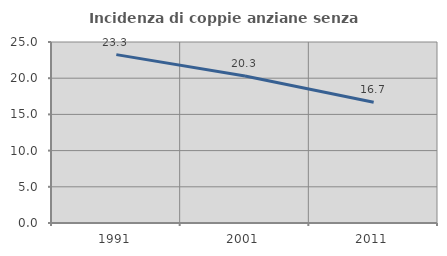
| Category | Incidenza di coppie anziane senza figli  |
|---|---|
| 1991.0 | 23.256 |
| 2001.0 | 20.301 |
| 2011.0 | 16.667 |